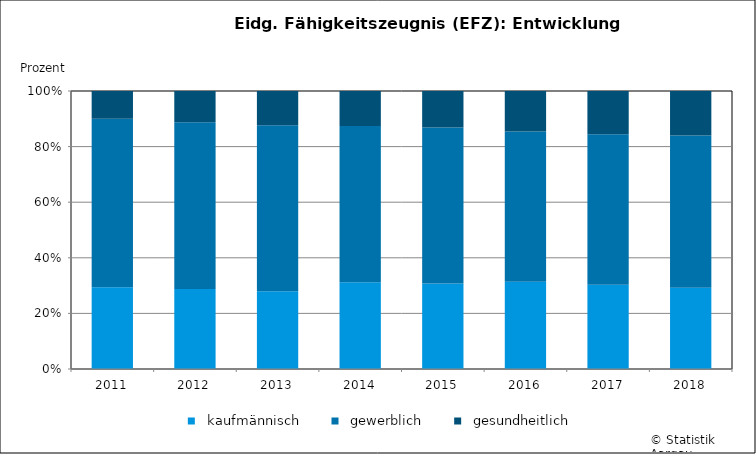
| Category |   kaufmännisch |   gewerblich |   gesundheitlich |
|---|---|---|---|
| 2011 | 1346 | 2777 | 458 |
| 2012 | 1418 | 2958 | 552 |
| 2013 | 1319 | 2821 | 582 |
| 2014 | 1467 | 2645 | 594 |
| 2015 | 1437 | 2628 | 614 |
| 2016 | 1469 | 2536 | 681 |
| 2017 | 1403 | 2501 | 721 |
| 2018 | 1390 | 2601 | 760 |